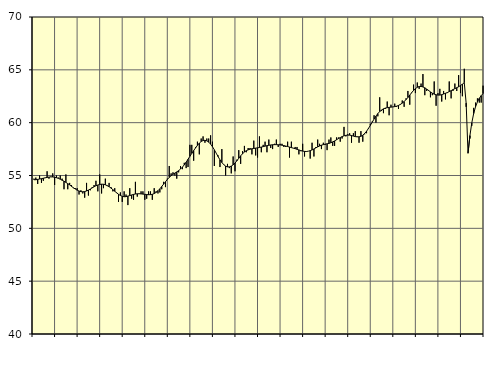
| Category | Samtliga fast anställda (inkl. fast anställda utomlands) | Series 1 |
|---|---|---|
| nan | 54.7 | 54.6 |
| 1.0 | 54.8 | 54.6 |
| 1.0 | 54.2 | 54.63 |
| 1.0 | 55 | 54.67 |
| 1.0 | 54.3 | 54.7 |
| 1.0 | 54.5 | 54.74 |
| 1.0 | 54.8 | 54.78 |
| 1.0 | 55.4 | 54.82 |
| 1.0 | 54.7 | 54.85 |
| 1.0 | 54.9 | 54.87 |
| 1.0 | 55.2 | 54.86 |
| 1.0 | 54.1 | 54.84 |
| nan | 55 | 54.79 |
| 2.0 | 54.8 | 54.73 |
| 2.0 | 55 | 54.65 |
| 2.0 | 54.7 | 54.55 |
| 2.0 | 53.7 | 54.46 |
| 2.0 | 55.1 | 54.35 |
| 2.0 | 53.7 | 54.23 |
| 2.0 | 54.3 | 54.11 |
| 2.0 | 54.1 | 53.97 |
| 2.0 | 53.8 | 53.84 |
| 2.0 | 53.8 | 53.72 |
| 2.0 | 53.8 | 53.61 |
| nan | 53.2 | 53.53 |
| 3.0 | 53.6 | 53.47 |
| 3.0 | 53.3 | 53.46 |
| 3.0 | 52.9 | 53.48 |
| 3.0 | 54.3 | 53.54 |
| 3.0 | 53.1 | 53.62 |
| 3.0 | 53.6 | 53.72 |
| 3.0 | 53.9 | 53.83 |
| 3.0 | 54.1 | 53.93 |
| 3.0 | 54.5 | 54.03 |
| 3.0 | 53.5 | 54.1 |
| 3.0 | 55.1 | 54.15 |
| nan | 53.3 | 54.18 |
| 4.0 | 53.8 | 54.17 |
| 4.0 | 54.7 | 54.12 |
| 4.0 | 54 | 54.04 |
| 4.0 | 54.3 | 53.94 |
| 4.0 | 53.9 | 53.81 |
| 4.0 | 53.5 | 53.66 |
| 4.0 | 53.8 | 53.51 |
| 4.0 | 53.4 | 53.36 |
| 4.0 | 52.5 | 53.22 |
| 4.0 | 53.4 | 53.11 |
| 4.0 | 52.5 | 53.03 |
| nan | 53.5 | 52.99 |
| 5.0 | 53.2 | 53 |
| 5.0 | 52.2 | 53.05 |
| 5.0 | 53.8 | 53.1 |
| 5.0 | 52.8 | 53.16 |
| 5.0 | 52.7 | 53.21 |
| 5.0 | 54.4 | 53.25 |
| 5.0 | 53 | 53.27 |
| 5.0 | 53.3 | 53.27 |
| 5.0 | 53.5 | 53.26 |
| 5.0 | 53.5 | 53.24 |
| 5.0 | 52.7 | 53.22 |
| nan | 52.8 | 53.2 |
| 6.0 | 53.5 | 53.18 |
| 6.0 | 53.5 | 53.19 |
| 6.0 | 52.7 | 53.22 |
| 6.0 | 53.8 | 53.29 |
| 6.0 | 53.5 | 53.4 |
| 6.0 | 53.3 | 53.56 |
| 6.0 | 53.4 | 53.74 |
| 6.0 | 53.7 | 53.96 |
| 6.0 | 54.4 | 54.18 |
| 6.0 | 53.9 | 54.41 |
| 6.0 | 54.7 | 54.63 |
| nan | 55.9 | 54.82 |
| 7.0 | 55.2 | 54.98 |
| 7.0 | 55.3 | 55.11 |
| 7.0 | 55 | 55.23 |
| 7.0 | 54.7 | 55.34 |
| 7.0 | 55.3 | 55.46 |
| 7.0 | 55.9 | 55.61 |
| 7.0 | 55.6 | 55.79 |
| 7.0 | 56.2 | 56.01 |
| 7.0 | 55.7 | 56.26 |
| 7.0 | 55.8 | 56.54 |
| 7.0 | 57.9 | 56.82 |
| nan | 57.9 | 57.09 |
| 8.0 | 56.4 | 57.36 |
| 8.0 | 57.7 | 57.61 |
| 8.0 | 58.2 | 57.85 |
| 8.0 | 57 | 58.06 |
| 8.0 | 58.5 | 58.22 |
| 8.0 | 58.7 | 58.31 |
| 8.0 | 58.1 | 58.33 |
| 8.0 | 58.5 | 58.28 |
| 8.0 | 58.5 | 58.16 |
| 8.0 | 58.8 | 57.97 |
| 8.0 | 58.2 | 57.73 |
| nan | 55.9 | 57.43 |
| 9.0 | 57.1 | 57.11 |
| 9.0 | 56.9 | 56.79 |
| 9.0 | 55.8 | 56.48 |
| 9.0 | 57.5 | 56.23 |
| 9.0 | 56 | 56.03 |
| 9.0 | 55 | 55.89 |
| 9.0 | 56.1 | 55.82 |
| 9.0 | 55.7 | 55.82 |
| 9.0 | 55.2 | 55.89 |
| 9.0 | 56.8 | 56.01 |
| 9.0 | 55.4 | 56.18 |
| nan | 56.5 | 56.39 |
| 10.0 | 57.4 | 56.63 |
| 10.0 | 56.1 | 56.86 |
| 10.0 | 57.3 | 57.06 |
| 10.0 | 57.8 | 57.22 |
| 10.0 | 57.2 | 57.35 |
| 10.0 | 57.6 | 57.43 |
| 10.0 | 57.6 | 57.49 |
| 10.0 | 57 | 57.53 |
| 10.0 | 58.3 | 57.56 |
| 10.0 | 56.9 | 57.59 |
| 10.0 | 56.7 | 57.62 |
| nan | 58.7 | 57.65 |
| 11.0 | 57.2 | 57.69 |
| 11.0 | 57.9 | 57.73 |
| 11.0 | 58.2 | 57.78 |
| 11.0 | 57.2 | 57.82 |
| 11.0 | 58.4 | 57.86 |
| 11.0 | 57.6 | 57.89 |
| 11.0 | 57.5 | 57.91 |
| 11.0 | 58 | 57.92 |
| 11.0 | 58.4 | 57.92 |
| 11.0 | 57.7 | 57.91 |
| 11.0 | 58 | 57.89 |
| nan | 58 | 57.87 |
| 12.0 | 57.7 | 57.83 |
| 12.0 | 57.7 | 57.79 |
| 12.0 | 58.2 | 57.74 |
| 12.0 | 56.7 | 57.69 |
| 12.0 | 58.2 | 57.64 |
| 12.0 | 57.6 | 57.59 |
| 12.0 | 57.7 | 57.54 |
| 12.0 | 57.7 | 57.48 |
| 12.0 | 57 | 57.42 |
| 12.0 | 57.3 | 57.36 |
| 12.0 | 58 | 57.31 |
| nan | 56.8 | 57.28 |
| 13.0 | 57.3 | 57.27 |
| 13.0 | 57.3 | 57.3 |
| 13.0 | 56.6 | 57.35 |
| 13.0 | 58.1 | 57.42 |
| 13.0 | 56.8 | 57.51 |
| 13.0 | 57.7 | 57.61 |
| 13.0 | 58.4 | 57.71 |
| 13.0 | 58 | 57.79 |
| 13.0 | 57.5 | 57.87 |
| 13.0 | 58.1 | 57.92 |
| 13.0 | 57.9 | 57.97 |
| nan | 57.4 | 58 |
| 14.0 | 58.4 | 58.04 |
| 14.0 | 58.6 | 58.1 |
| 14.0 | 57.8 | 58.18 |
| 14.0 | 57.8 | 58.27 |
| 14.0 | 58.6 | 58.38 |
| 14.0 | 58.6 | 58.49 |
| 14.0 | 58.2 | 58.59 |
| 14.0 | 58.5 | 58.68 |
| 14.0 | 59.6 | 58.76 |
| 14.0 | 58.7 | 58.8 |
| 14.0 | 58.9 | 58.82 |
| nan | 59 | 58.82 |
| 15.0 | 58.1 | 58.78 |
| 15.0 | 59 | 58.73 |
| 15.0 | 59.2 | 58.68 |
| 15.0 | 58.7 | 58.66 |
| 15.0 | 58.1 | 58.66 |
| 15.0 | 59.2 | 58.71 |
| 15.0 | 58.2 | 58.81 |
| 15.0 | 58.9 | 58.98 |
| 15.0 | 59 | 59.19 |
| 15.0 | 59.4 | 59.45 |
| 15.0 | 59.9 | 59.74 |
| nan | 60.1 | 60.04 |
| 16.0 | 60.7 | 60.34 |
| 16.0 | 60 | 60.62 |
| 16.0 | 60.6 | 60.86 |
| 16.0 | 62.4 | 61.05 |
| 16.0 | 61.1 | 61.2 |
| 16.0 | 60.9 | 61.31 |
| 16.0 | 61.3 | 61.38 |
| 16.0 | 62 | 61.42 |
| 16.0 | 60.7 | 61.45 |
| 16.0 | 61.7 | 61.47 |
| 16.0 | 61.5 | 61.49 |
| nan | 61.8 | 61.52 |
| 17.0 | 61.5 | 61.56 |
| 17.0 | 61.3 | 61.63 |
| 17.0 | 61.7 | 61.73 |
| 17.0 | 62.1 | 61.85 |
| 17.0 | 61.5 | 62 |
| 17.0 | 62.3 | 62.18 |
| 17.0 | 63 | 62.38 |
| 17.0 | 61.7 | 62.61 |
| 17.0 | 62.8 | 62.84 |
| 17.0 | 63.6 | 63.05 |
| 17.0 | 62.8 | 63.22 |
| nan | 63.8 | 63.35 |
| 18.0 | 63.2 | 63.42 |
| 18.0 | 63.7 | 63.43 |
| 18.0 | 64.6 | 63.38 |
| 18.0 | 62.6 | 63.3 |
| 18.0 | 63 | 63.18 |
| 18.0 | 63 | 63.05 |
| 18.0 | 62.4 | 62.91 |
| 18.0 | 62.6 | 62.79 |
| 18.0 | 63.9 | 62.7 |
| 18.0 | 61.6 | 62.64 |
| 18.0 | 62.8 | 62.61 |
| nan | 63.2 | 62.61 |
| 19.0 | 62 | 62.65 |
| 19.0 | 63 | 62.71 |
| 19.0 | 62.2 | 62.78 |
| 19.0 | 62.8 | 62.85 |
| 19.0 | 63.9 | 62.94 |
| 19.0 | 62.3 | 63.03 |
| 19.0 | 63 | 63.13 |
| 19.0 | 63.7 | 63.22 |
| 19.0 | 63 | 63.31 |
| 19.0 | 64.5 | 63.4 |
| 19.0 | 62.8 | 63.52 |
| nan | 62.5 | 63.64 |
| 20.0 | 65.1 | 63.79 |
| 20.0 | 61.5 | 61.85 |
| 20.0 | 57.1 | 57.11 |
| 20.0 | 58.5 | 58.77 |
| 20.0 | 59.7 | 59.98 |
| 20.0 | 61.4 | 60.86 |
| 20.0 | 61.9 | 61.5 |
| 20.0 | 62.3 | 61.97 |
| 20.0 | 61.9 | 62.31 |
| 20.0 | 61.9 | 62.56 |
| 20.0 | 63.5 | 62.75 |